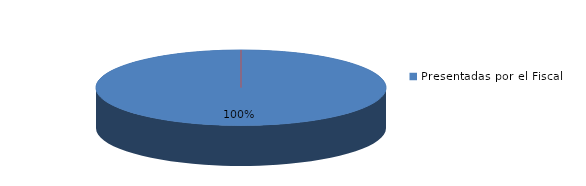
| Category | Series 0 |
|---|---|
| Presentadas por el Fiscal | 171 |
| Presentadas por particulares | 0 |